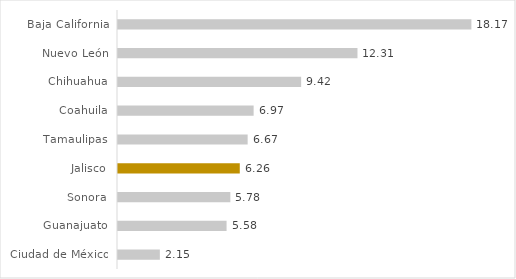
| Category | Series 0 |
|---|---|
| Ciudad de México | 2.152 |
| Guanajuato | 5.582 |
| Sonora | 5.776 |
| Jalisco | 6.261 |
| Tamaulipas | 6.666 |
| Coahuila | 6.973 |
| Chihuahua | 9.416 |
| Nuevo León | 12.312 |
| Baja California | 18.169 |